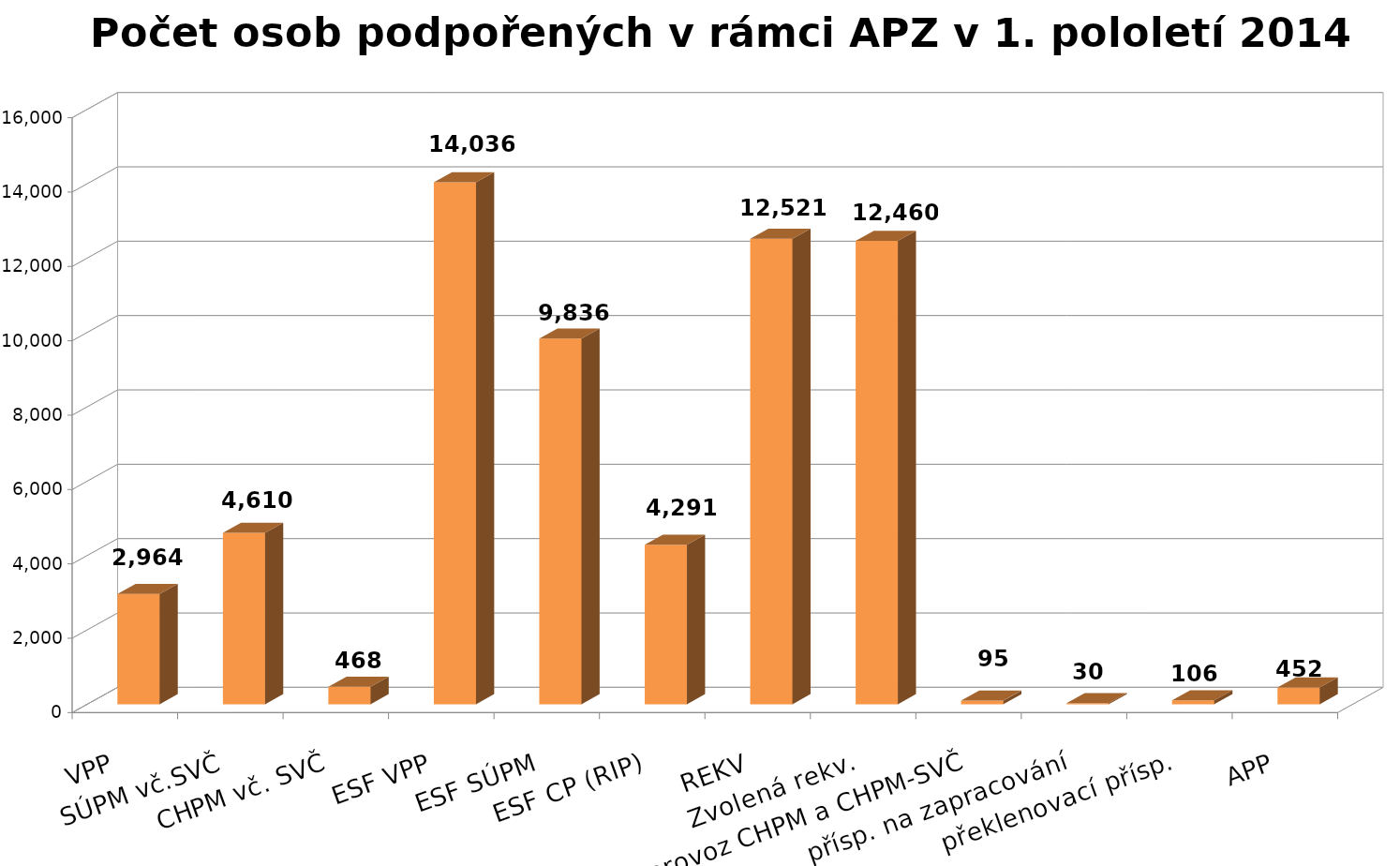
| Category | Series 0 |
|---|---|
| VPP | 2964 |
| SÚPM vč.SVČ | 4610 |
| CHPM vč. SVČ | 468 |
| ESF VPP | 14036 |
| ESF SÚPM | 9836 |
| ESF CP (RIP) | 4291 |
| REKV | 12521 |
| Zvolená rekv. | 12460 |
| přísp. na provoz CHPM a CHPM-SVČ | 95 |
| přísp. na zapracování | 30 |
| překlenovací přísp. | 106 |
| APP | 452 |